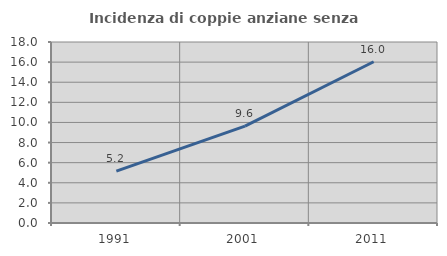
| Category | Incidenza di coppie anziane senza figli  |
|---|---|
| 1991.0 | 5.167 |
| 2001.0 | 9.626 |
| 2011.0 | 16.035 |